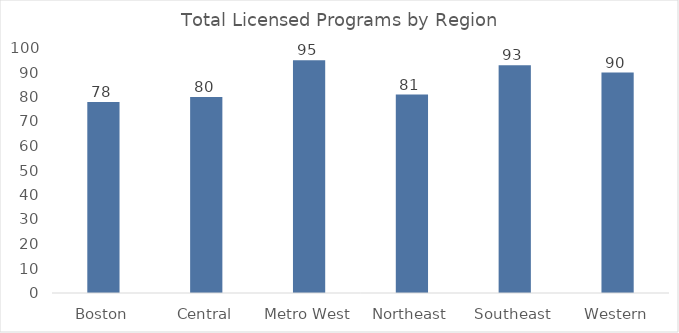
| Category | Total |
|---|---|
| Boston | 78 |
| Central | 80 |
| Metro West | 95 |
| Northeast | 81 |
| Southeast | 93 |
| Western | 90 |